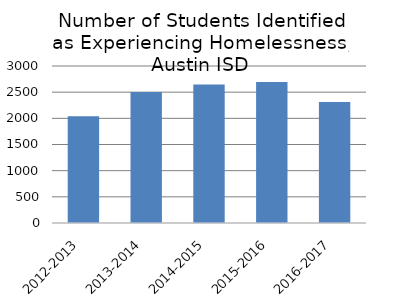
| Category | Series 0 |
|---|---|
| 2012-2013 | 2038 |
| 2013-2014 | 2505 |
| 2014-2015 | 2648 |
| 2015-2016 | 2693 |
| 2016-2017 | 2311 |